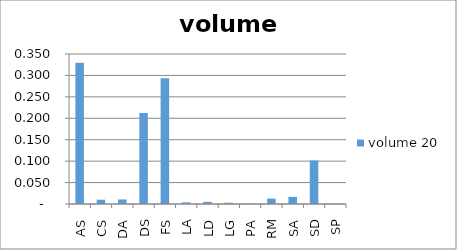
| Category |  volume 20  |
|---|---|
| AS | 0.329 |
| CS | 0.01 |
| DA | 0.011 |
| DS | 0.212 |
| FS | 0.293 |
| LA | 0.004 |
| LD | 0.005 |
| LG | 0.003 |
| PA | 0.001 |
| RM | 0.013 |
| SA | 0.017 |
| SD | 0.102 |
| SP | 0.001 |